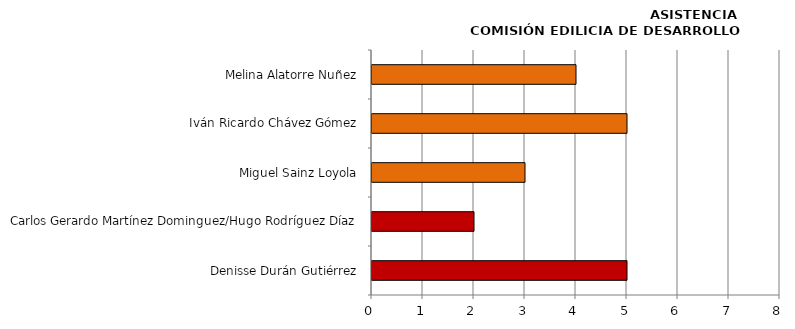
| Category | Series 0 |
|---|---|
| Denisse Durán Gutiérrez | 5 |
| Carlos Gerardo Martínez Dominguez/Hugo Rodríguez Díaz | 2 |
| Miguel Sainz Loyola | 3 |
| Iván Ricardo Chávez Gómez | 5 |
| Melina Alatorre Nuñez | 4 |